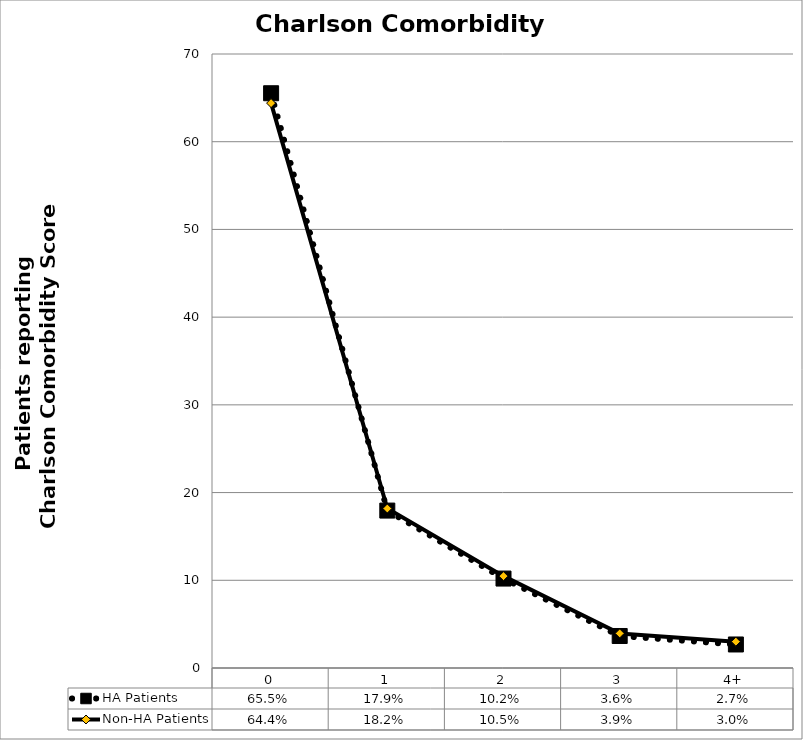
| Category | HA Patients | Non-HA Patients |
|---|---|---|
| 0 | 65.527 | 64.4 |
| 1 | 17.947 | 18.184 |
| 2 | 10.197 | 10.472 |
| 3 | 3.649 | 3.941 |
| 4+ | 2.681 | 3.004 |